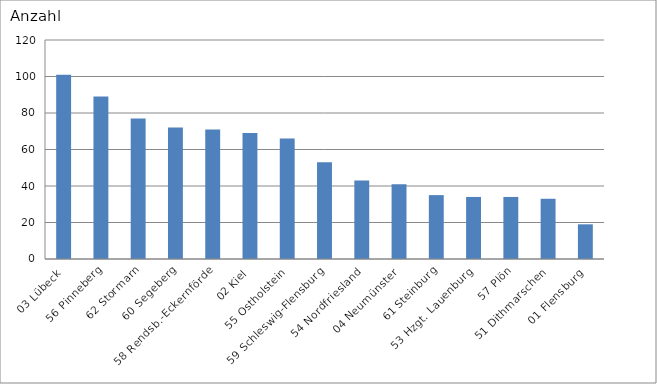
| Category | 03 Lübeck 56 Pinneberg 62 Stormarn 60 Segeberg 58 Rendsb.-Eckernförde 02 Kiel 55 Ostholstein 59 Schleswig-Flensburg 54 Nordfriesland 04 Neumünster 61 Steinburg 53 Hzgt. Lauenburg 57 Plön 51 Dithmarschen 01 Flensburg |
|---|---|
| 03 Lübeck | 101 |
| 56 Pinneberg | 89 |
| 62 Stormarn | 77 |
| 60 Segeberg | 72 |
| 58 Rendsb.-Eckernförde | 71 |
| 02 Kiel | 69 |
| 55 Ostholstein | 66 |
| 59 Schleswig-Flensburg | 53 |
| 54 Nordfriesland | 43 |
| 04 Neumünster | 41 |
| 61 Steinburg | 35 |
| 53 Hzgt. Lauenburg | 34 |
| 57 Plön | 34 |
| 51 Dithmarschen | 33 |
| 01 Flensburg | 19 |